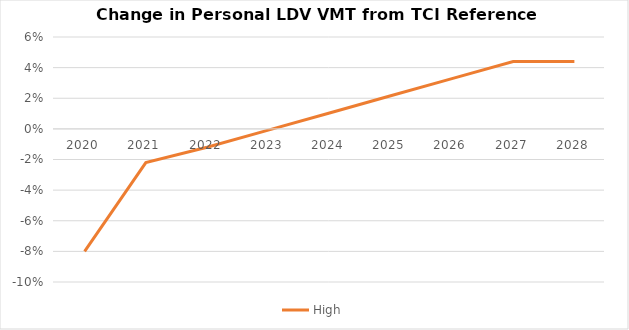
| Category | High |
|---|---|
| 2020.0 | -0.08 |
| 2021.0 | -0.022 |
| 2022.0 | -0.012 |
| 2023.0 | -0.001 |
| 2024.0 | 0.01 |
| 2025.0 | 0.022 |
| 2026.0 | 0.033 |
| 2027.0 | 0.044 |
| 2028.0 | 0.044 |